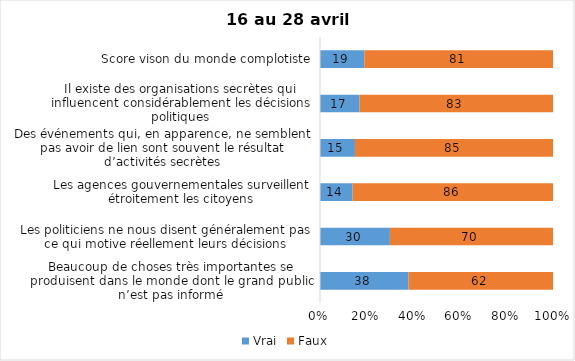
| Category | Vrai | Faux |
|---|---|---|
| Beaucoup de choses très importantes se produisent dans le monde dont le grand public n’est pas informé | 38 | 62 |
| Les politiciens ne nous disent généralement pas ce qui motive réellement leurs décisions | 30 | 70 |
| Les agences gouvernementales surveillent étroitement les citoyens | 14 | 86 |
| Des événements qui, en apparence, ne semblent pas avoir de lien sont souvent le résultat d’activités secrètes | 15 | 85 |
| Il existe des organisations secrètes qui influencent considérablement les décisions politiques | 17 | 83 |
| Score vison du monde complotiste | 19 | 81 |